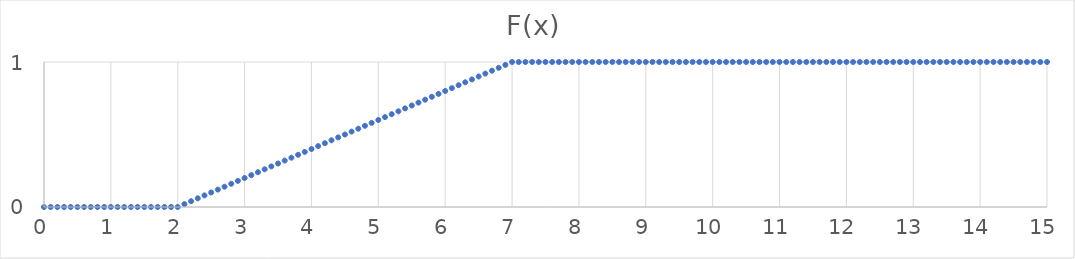
| Category | Series 0 |
|---|---|
| 0.0 | 0 |
| 0.1 | 0 |
| 0.2 | 0 |
| 0.3 | 0 |
| 0.4 | 0 |
| 0.5 | 0 |
| 0.6 | 0 |
| 0.7 | 0 |
| 0.8 | 0 |
| 0.9 | 0 |
| 1.0 | 0 |
| 1.1 | 0 |
| 1.2 | 0 |
| 1.3 | 0 |
| 1.4 | 0 |
| 1.5 | 0 |
| 1.6 | 0 |
| 1.7 | 0 |
| 1.8 | 0 |
| 1.9 | 0 |
| 2.0 | 0 |
| 2.1 | 0.02 |
| 2.2 | 0.04 |
| 2.3 | 0.06 |
| 2.4 | 0.08 |
| 2.5 | 0.1 |
| 2.6 | 0.12 |
| 2.7 | 0.14 |
| 2.8 | 0.16 |
| 2.9 | 0.18 |
| 3.0 | 0.2 |
| 3.1 | 0.22 |
| 3.2 | 0.24 |
| 3.3 | 0.26 |
| 3.4 | 0.28 |
| 3.5 | 0.3 |
| 3.6 | 0.32 |
| 3.7 | 0.34 |
| 3.8 | 0.36 |
| 3.9 | 0.38 |
| 4.0 | 0.4 |
| 4.1 | 0.42 |
| 4.2 | 0.44 |
| 4.3 | 0.46 |
| 4.4 | 0.48 |
| 4.5 | 0.5 |
| 4.6 | 0.52 |
| 4.7 | 0.54 |
| 4.8 | 0.56 |
| 4.9 | 0.58 |
| 5.0 | 0.6 |
| 5.1 | 0.62 |
| 5.2 | 0.64 |
| 5.3 | 0.66 |
| 5.4 | 0.68 |
| 5.5 | 0.7 |
| 5.6 | 0.72 |
| 5.7 | 0.74 |
| 5.8 | 0.76 |
| 5.9 | 0.78 |
| 6.0 | 0.8 |
| 6.1 | 0.82 |
| 6.2 | 0.84 |
| 6.3 | 0.86 |
| 6.4 | 0.88 |
| 6.5 | 0.9 |
| 6.6 | 0.92 |
| 6.7 | 0.94 |
| 6.8 | 0.96 |
| 6.9 | 0.98 |
| 7.0 | 1 |
| 7.1 | 1 |
| 7.2 | 1 |
| 7.3 | 1 |
| 7.4 | 1 |
| 7.5 | 1 |
| 7.6 | 1 |
| 7.7 | 1 |
| 7.8 | 1 |
| 7.9 | 1 |
| 8.0 | 1 |
| 8.1 | 1 |
| 8.2 | 1 |
| 8.3 | 1 |
| 8.4 | 1 |
| 8.5 | 1 |
| 8.6 | 1 |
| 8.7 | 1 |
| 8.8 | 1 |
| 8.9 | 1 |
| 9.0 | 1 |
| 9.1 | 1 |
| 9.2 | 1 |
| 9.3 | 1 |
| 9.4 | 1 |
| 9.5 | 1 |
| 9.6 | 1 |
| 9.7 | 1 |
| 9.8 | 1 |
| 9.9 | 1 |
| 10.0 | 1 |
| 10.1 | 1 |
| 10.2 | 1 |
| 10.3 | 1 |
| 10.4 | 1 |
| 10.5 | 1 |
| 10.6 | 1 |
| 10.7 | 1 |
| 10.8 | 1 |
| 10.9 | 1 |
| 11.0 | 1 |
| 11.1 | 1 |
| 11.2 | 1 |
| 11.3 | 1 |
| 11.4 | 1 |
| 11.5 | 1 |
| 11.6 | 1 |
| 11.7 | 1 |
| 11.8 | 1 |
| 11.9 | 1 |
| 12.0 | 1 |
| 12.1 | 1 |
| 12.2 | 1 |
| 12.3 | 1 |
| 12.4 | 1 |
| 12.5 | 1 |
| 12.6 | 1 |
| 12.7 | 1 |
| 12.8 | 1 |
| 12.9 | 1 |
| 13.0 | 1 |
| 13.1 | 1 |
| 13.2 | 1 |
| 13.3 | 1 |
| 13.4 | 1 |
| 13.5 | 1 |
| 13.6 | 1 |
| 13.7 | 1 |
| 13.8 | 1 |
| 13.9 | 1 |
| 14.0 | 1 |
| 14.1 | 1 |
| 14.2 | 1 |
| 14.3 | 1 |
| 14.4 | 1 |
| 14.5 | 1 |
| 14.6 | 1 |
| 14.7 | 1 |
| 14.8 | 1 |
| 14.9 | 1 |
| 15.0 | 1 |